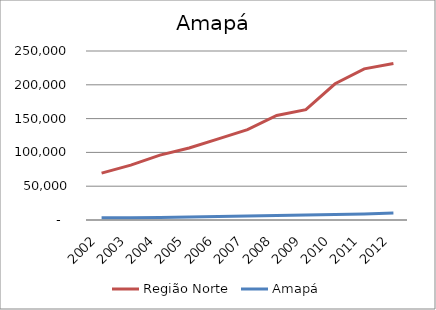
| Category | Região Norte | Amapá |
|---|---|---|
| 2002.0 | 69309.957 | 3291.534 |
| 2003.0 | 81199.581 | 3434.107 |
| 2004.0 | 96012.341 | 3846.126 |
| 2005.0 | 106441.71 | 4361.255 |
| 2006.0 | 119993.429 | 5260.017 |
| 2007.0 | 133578.391 | 6022.132 |
| 2008.0 | 154703.433 | 6764.834 |
| 2009.0 | 163207.956 | 7404.389 |
| 2010.0 | 201510.748 | 8265.965 |
| 2011.0 | 223537.9 | 8968.032 |
| 2012.0 | 231383.089 | 10419.539 |